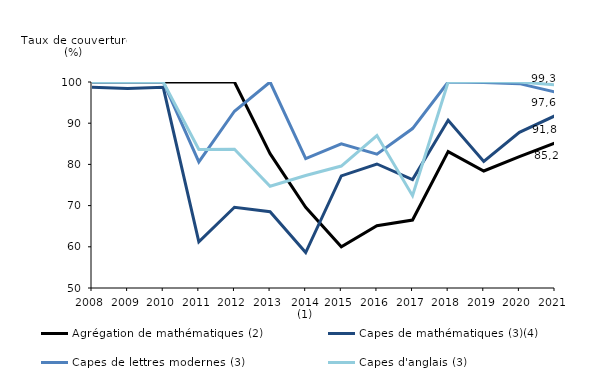
| Category | Agrégation de mathématiques (2) | Capes de mathématiques (3)(4) | Capes de lettres modernes (3) | Capes d'anglais (3) |
|---|---|---|---|---|
| 2008 | 100 | 98.7 | 100 | 100 |
| 2009 | 100 | 98.4 | 100 | 100 |
| 2010 | 100 | 98.7 | 100 | 100 |
| 2011 | 100 | 61.2 | 80.6 | 83.6 |
| 2012 | 100 | 69.6 | 92.9 | 83.7 |
| 2013 | 82.6 | 68.5 | 100 | 74.7 |
| 2014 (1) | 69.6 | 58.6 | 81.4 | 77.3 |
| 2015 | 60 | 77.2 | 85 | 79.6 |
| 2016 | 65.1 | 80.1 | 82.5 | 87 |
| 2017 | 66.5 | 76.3 | 88.7 | 72.4 |
| 2018 | 83.1 | 90.7 | 100 | 100 |
| 2019 | 78.4 | 80.7 | 99.9 | 100.1 |
| 2020 | 81.9 | 87.8 | 99.6 | 100 |
| 2021 | 85.2 | 91.8 | 97.586 | 99.327 |